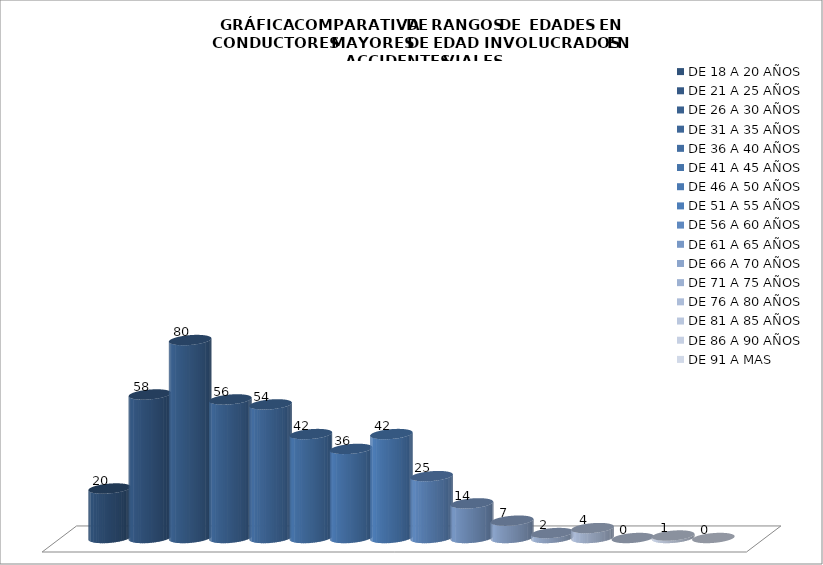
| Category | DE 18 A 20 AÑOS | DE 21 A 25 AÑOS | DE 26 A 30 AÑOS | DE 31 A 35 AÑOS | DE 36 A 40 AÑOS | DE 41 A 45 AÑOS | DE 46 A 50 AÑOS | DE 51 A 55 AÑOS | DE 56 A 60 AÑOS | DE 61 A 65 AÑOS | DE 66 A 70 AÑOS | DE 71 A 75 AÑOS | DE 76 A 80 AÑOS | DE 81 A 85 AÑOS | DE 86 A 90 AÑOS | DE 91 A MAS |
|---|---|---|---|---|---|---|---|---|---|---|---|---|---|---|---|---|
| 0 | 20 | 58 | 80 | 56 | 54 | 42 | 36 | 42 | 25 | 14 | 7 | 2 | 4 | 0 | 1 | 0 |